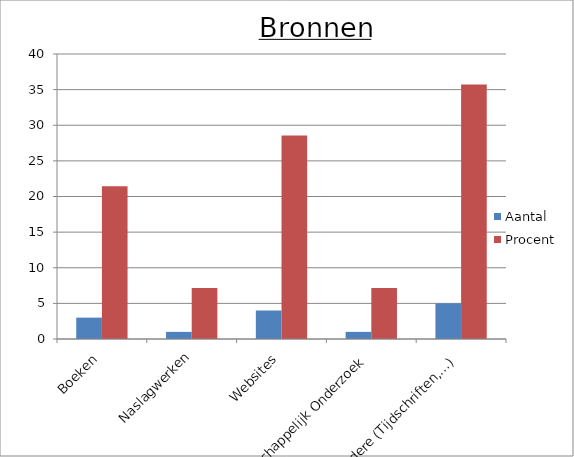
| Category | Aantal | Procent |
|---|---|---|
| Boeken | 3 | 21.429 |
| Naslagwerken | 1 | 7.143 |
| Websites | 4 | 28.571 |
| Wetenschappelijk Onderzoek | 1 | 7.143 |
| Andere (Tijdschriften,…) | 5 | 35.714 |